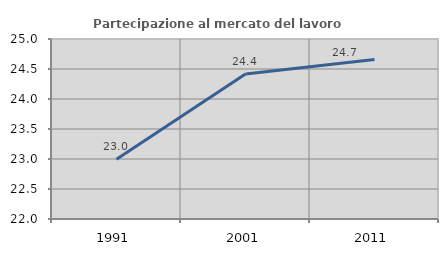
| Category | Partecipazione al mercato del lavoro  femminile |
|---|---|
| 1991.0 | 22.995 |
| 2001.0 | 24.418 |
| 2011.0 | 24.658 |